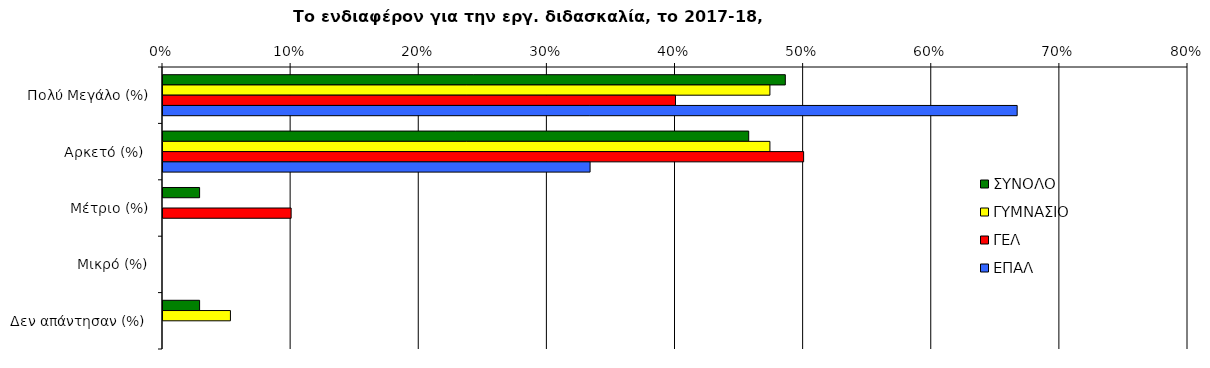
| Category | ΣΥΝΟΛΟ | ΓΥΜΝΑΣΙΟ | ΓΕΛ | ΕΠΑΛ |
|---|---|---|---|---|
| Πολύ Μεγάλο (%) | 0.486 | 0.474 | 0.4 | 0.667 |
|  Αρκετό (%)  | 0.457 | 0.474 | 0.5 | 0.333 |
| Μέτριο (%) | 0.029 | 0 | 0.1 | 0 |
| Μικρό (%) | 0 | 0 | 0 | 0 |
|  Δεν απάντησαν (%)  | 0.029 | 0.053 | 0 | 0 |